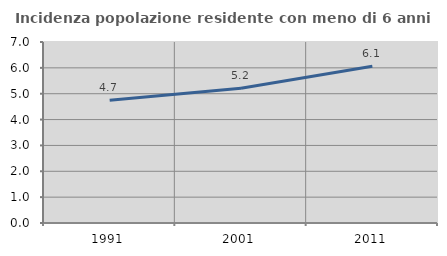
| Category | Incidenza popolazione residente con meno di 6 anni |
|---|---|
| 1991.0 | 4.743 |
| 2001.0 | 5.211 |
| 2011.0 | 6.064 |